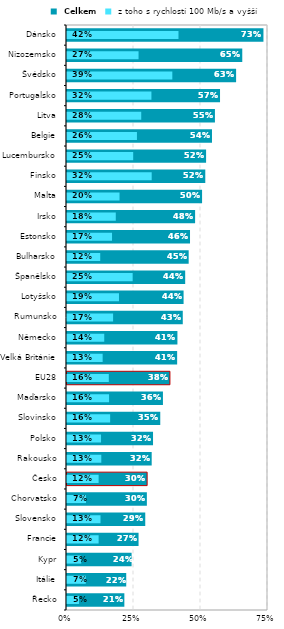
| Category |  Celkem |
|---|---|
| Řecko | 0.214 |
| Itálie | 0.221 |
| Kypr | 0.241 |
| Francie | 0.267 |
| Slovensko | 0.292 |
| Chorvatsko | 0.298 |
| Česko | 0.299 |
| Rakousko | 0.316 |
| Polsko | 0.321 |
| Slovinsko | 0.348 |
| Maďarsko | 0.358 |
| EU28 | 0.384 |
| Velká Británie | 0.411 |
| Německo | 0.412 |
| Rumunsko | 0.432 |
| Lotyšsko | 0.435 |
| Španělsko | 0.441 |
| Bulharsko | 0.454 |
| Estonsko | 0.459 |
| Irsko | 0.478 |
| Malta | 0.504 |
| Finsko | 0.516 |
| Lucembursko | 0.519 |
| Belgie | 0.541 |
| Litva | 0.552 |
| Portugalsko | 0.571 |
| Švédsko | 0.631 |
| Nizozemsko | 0.654 |
| Dánsko | 0.733 |